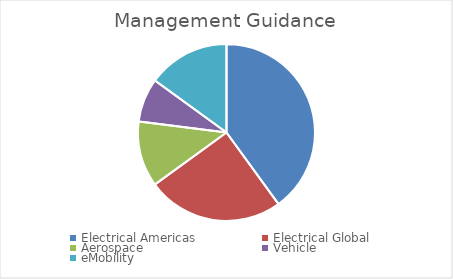
| Category | Management Guidance |
|---|---|
| Electrical Americas | 0.4 |
| Electrical Global | 0.25 |
| Aerospace | 0.12 |
| Vehicle | 0.08 |
| eMobility | 0.15 |